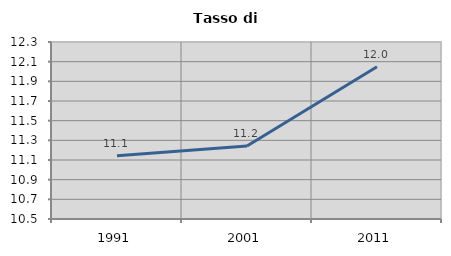
| Category | Tasso di disoccupazione   |
|---|---|
| 1991.0 | 11.144 |
| 2001.0 | 11.243 |
| 2011.0 | 12.048 |